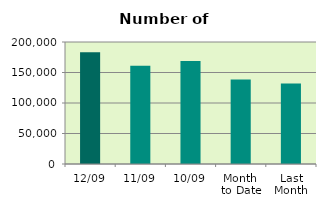
| Category | Series 0 |
|---|---|
| 12/09 | 183218 |
| 11/09 | 160970 |
| 10/09 | 168862 |
| Month 
to Date | 138339.333 |
| Last
Month | 132110.818 |